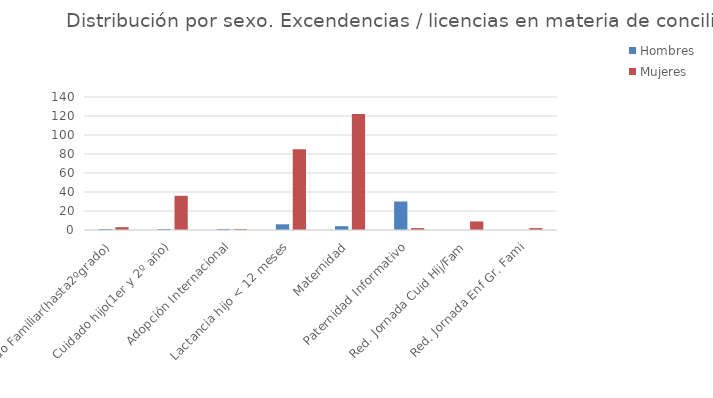
| Category | Hombres | Mujeres |
|---|---|---|
| Cuidado Familiar(hasta2ºgrado) | 1 | 3 |
| Cuidado hijo(1er y 2º año) | 1 | 36 |
| Adopción Internacional | 1 | 1 |
| Lactancia hijo < 12 meses | 6 | 85 |
| Maternidad | 4 | 122 |
| Paternidad Informativo | 30 | 2 |
| Red. Jornada Cuid Hij/Fam | 0 | 9 |
| Red. Jornada Enf Gr. Fami | 0 | 2 |